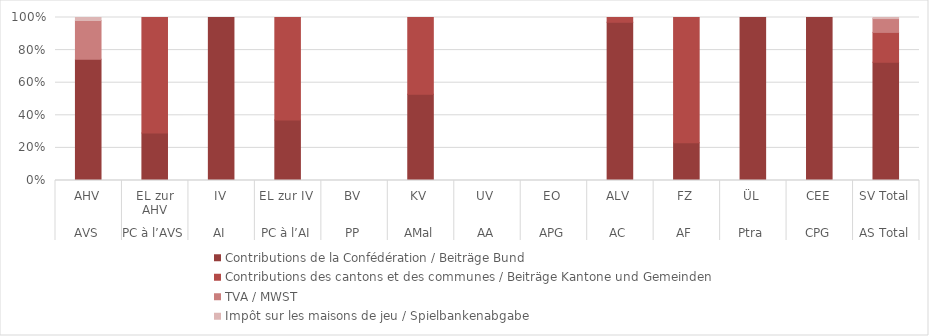
| Category | Contributions de la Confédération / Beiträge Bund | Contributions des cantons et des communes / Beiträge Kantone und Gemeinden | TVA / MWST | Impôt sur les maisons de jeu / Spielbankenabgabe |
|---|---|---|---|---|
| 0 | 0.744 | 0 | 0.238 | 0.018 |
| 1 | 0.292 | 0.708 | 0 | 0 |
| 2 | 1 | 0 | 0 | 0 |
| 3 | 0.372 | 0.628 | 0 | 0 |
| 4 | 0 | 0 | 0 | 0 |
| 5 | 0.53 | 0.47 | 0 | 0 |
| 6 | 0 | 0 | 0 | 0 |
| 7 | 0 | 0 | 0 | 0 |
| 8 | 0.971 | 0.029 | 0 | 0 |
| 9 | 0.232 | 0.768 | 0 | 0 |
| 10 | 1 | 0 | 0 | 0 |
| 11 | 1 | 0 | 0 | 0 |
| 12 | 0.725 | 0.183 | 0.085 | 0.007 |